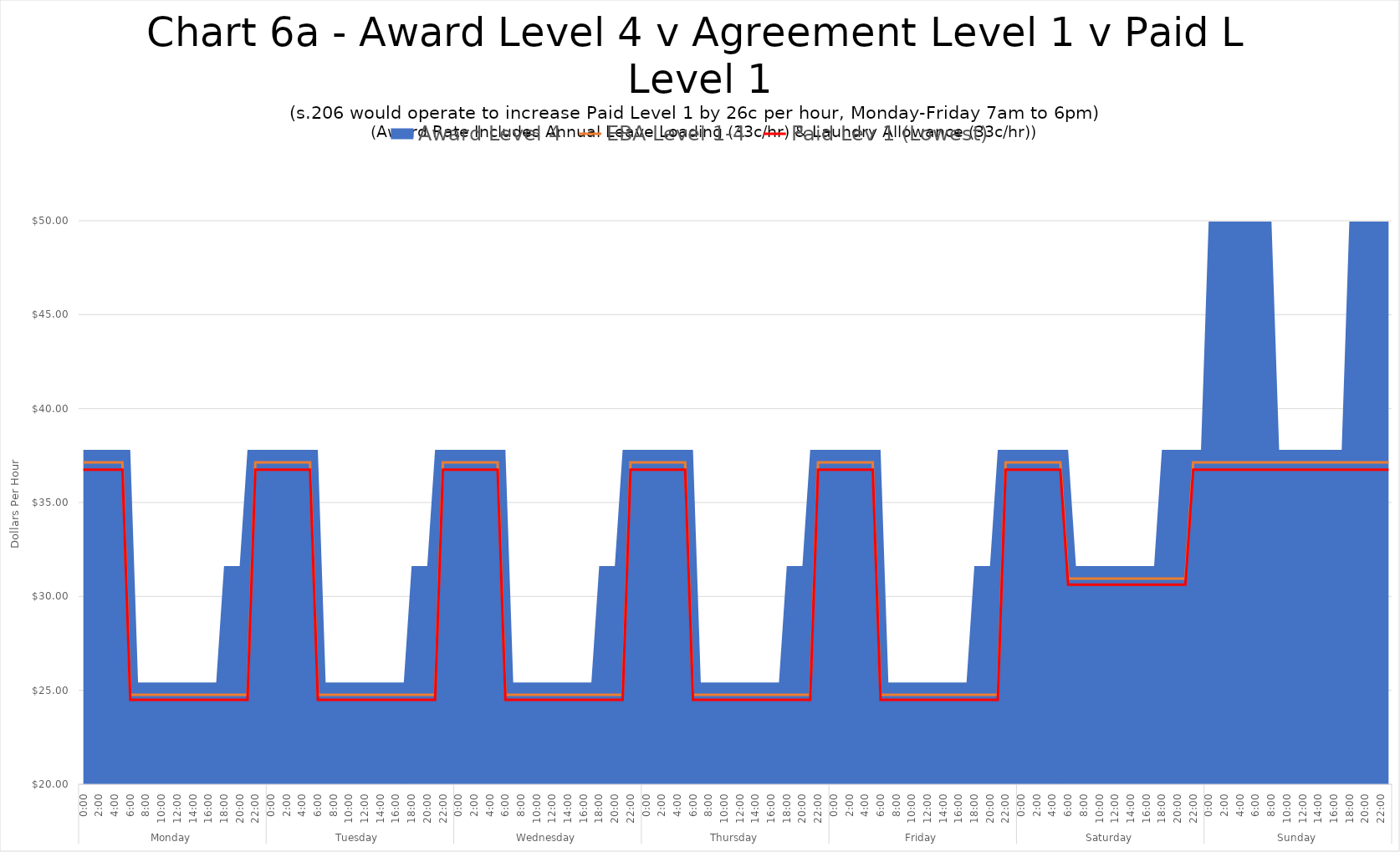
| Category | EBA Level 1-4 | Paid Lev 1 (Lowest) |
|---|---|---|
| 0 | 37.14 | 36.75 |
| 1 | 37.14 | 36.75 |
| 2 | 37.14 | 36.75 |
| 3 | 37.14 | 36.75 |
| 4 | 37.14 | 36.75 |
| 5 | 37.14 | 36.75 |
| 6 | 24.76 | 24.5 |
| 7 | 24.76 | 24.5 |
| 8 | 24.76 | 24.5 |
| 9 | 24.76 | 24.5 |
| 10 | 24.76 | 24.5 |
| 11 | 24.76 | 24.5 |
| 12 | 24.76 | 24.5 |
| 13 | 24.76 | 24.5 |
| 14 | 24.76 | 24.5 |
| 15 | 24.76 | 24.5 |
| 16 | 24.76 | 24.5 |
| 17 | 24.76 | 24.5 |
| 18 | 24.76 | 24.5 |
| 19 | 24.76 | 24.5 |
| 20 | 24.76 | 24.5 |
| 21 | 24.76 | 24.5 |
| 22 | 37.14 | 36.75 |
| 23 | 37.14 | 36.75 |
| 24 | 37.14 | 36.75 |
| 25 | 37.14 | 36.75 |
| 26 | 37.14 | 36.75 |
| 27 | 37.14 | 36.75 |
| 28 | 37.14 | 36.75 |
| 29 | 37.14 | 36.75 |
| 30 | 24.76 | 24.5 |
| 31 | 24.76 | 24.5 |
| 32 | 24.76 | 24.5 |
| 33 | 24.76 | 24.5 |
| 34 | 24.76 | 24.5 |
| 35 | 24.76 | 24.5 |
| 36 | 24.76 | 24.5 |
| 37 | 24.76 | 24.5 |
| 38 | 24.76 | 24.5 |
| 39 | 24.76 | 24.5 |
| 40 | 24.76 | 24.5 |
| 41 | 24.76 | 24.5 |
| 42 | 24.76 | 24.5 |
| 43 | 24.76 | 24.5 |
| 44 | 24.76 | 24.5 |
| 45 | 24.76 | 24.5 |
| 46 | 37.14 | 36.75 |
| 47 | 37.14 | 36.75 |
| 48 | 37.14 | 36.75 |
| 49 | 37.14 | 36.75 |
| 50 | 37.14 | 36.75 |
| 51 | 37.14 | 36.75 |
| 52 | 37.14 | 36.75 |
| 53 | 37.14 | 36.75 |
| 54 | 24.76 | 24.5 |
| 55 | 24.76 | 24.5 |
| 56 | 24.76 | 24.5 |
| 57 | 24.76 | 24.5 |
| 58 | 24.76 | 24.5 |
| 59 | 24.76 | 24.5 |
| 60 | 24.76 | 24.5 |
| 61 | 24.76 | 24.5 |
| 62 | 24.76 | 24.5 |
| 63 | 24.76 | 24.5 |
| 64 | 24.76 | 24.5 |
| 65 | 24.76 | 24.5 |
| 66 | 24.76 | 24.5 |
| 67 | 24.76 | 24.5 |
| 68 | 24.76 | 24.5 |
| 69 | 24.76 | 24.5 |
| 70 | 37.14 | 36.75 |
| 71 | 37.14 | 36.75 |
| 72 | 37.14 | 36.75 |
| 73 | 37.14 | 36.75 |
| 74 | 37.14 | 36.75 |
| 75 | 37.14 | 36.75 |
| 76 | 37.14 | 36.75 |
| 77 | 37.14 | 36.75 |
| 78 | 24.76 | 24.5 |
| 79 | 24.76 | 24.5 |
| 80 | 24.76 | 24.5 |
| 81 | 24.76 | 24.5 |
| 82 | 24.76 | 24.5 |
| 83 | 24.76 | 24.5 |
| 84 | 24.76 | 24.5 |
| 85 | 24.76 | 24.5 |
| 86 | 24.76 | 24.5 |
| 87 | 24.76 | 24.5 |
| 88 | 24.76 | 24.5 |
| 89 | 24.76 | 24.5 |
| 90 | 24.76 | 24.5 |
| 91 | 24.76 | 24.5 |
| 92 | 24.76 | 24.5 |
| 93 | 24.76 | 24.5 |
| 94 | 37.14 | 36.75 |
| 95 | 37.14 | 36.75 |
| 96 | 37.14 | 36.75 |
| 97 | 37.14 | 36.75 |
| 98 | 37.14 | 36.75 |
| 99 | 37.14 | 36.75 |
| 100 | 37.14 | 36.75 |
| 101 | 37.14 | 36.75 |
| 102 | 24.76 | 24.5 |
| 103 | 24.76 | 24.5 |
| 104 | 24.76 | 24.5 |
| 105 | 24.76 | 24.5 |
| 106 | 24.76 | 24.5 |
| 107 | 24.76 | 24.5 |
| 108 | 24.76 | 24.5 |
| 109 | 24.76 | 24.5 |
| 110 | 24.76 | 24.5 |
| 111 | 24.76 | 24.5 |
| 112 | 24.76 | 24.5 |
| 113 | 24.76 | 24.5 |
| 114 | 24.76 | 24.5 |
| 115 | 24.76 | 24.5 |
| 116 | 24.76 | 24.5 |
| 117 | 24.76 | 24.5 |
| 118 | 37.14 | 36.75 |
| 119 | 37.14 | 36.75 |
| 120 | 37.14 | 36.75 |
| 121 | 37.14 | 36.75 |
| 122 | 37.14 | 36.75 |
| 123 | 37.14 | 36.75 |
| 124 | 37.14 | 36.75 |
| 125 | 37.14 | 36.75 |
| 126 | 30.95 | 30.625 |
| 127 | 30.95 | 30.625 |
| 128 | 30.95 | 30.625 |
| 129 | 30.95 | 30.625 |
| 130 | 30.95 | 30.625 |
| 131 | 30.95 | 30.625 |
| 132 | 30.95 | 30.625 |
| 133 | 30.95 | 30.625 |
| 134 | 30.95 | 30.625 |
| 135 | 30.95 | 30.625 |
| 136 | 30.95 | 30.625 |
| 137 | 30.95 | 30.625 |
| 138 | 30.95 | 30.625 |
| 139 | 30.95 | 30.625 |
| 140 | 30.95 | 30.625 |
| 141 | 30.95 | 30.625 |
| 142 | 37.14 | 36.75 |
| 143 | 37.14 | 36.75 |
| 144 | 37.14 | 36.75 |
| 145 | 37.14 | 36.75 |
| 146 | 37.14 | 36.75 |
| 147 | 37.14 | 36.75 |
| 148 | 37.14 | 36.75 |
| 149 | 37.14 | 36.75 |
| 150 | 37.14 | 36.75 |
| 151 | 37.14 | 36.75 |
| 152 | 37.14 | 36.75 |
| 153 | 37.14 | 36.75 |
| 154 | 37.14 | 36.75 |
| 155 | 37.14 | 36.75 |
| 156 | 37.14 | 36.75 |
| 157 | 37.14 | 36.75 |
| 158 | 37.14 | 36.75 |
| 159 | 37.14 | 36.75 |
| 160 | 37.14 | 36.75 |
| 161 | 37.14 | 36.75 |
| 162 | 37.14 | 36.75 |
| 163 | 37.14 | 36.75 |
| 164 | 37.14 | 36.75 |
| 165 | 37.14 | 36.75 |
| 166 | 37.14 | 36.75 |
| 167 | 37.14 | 36.75 |